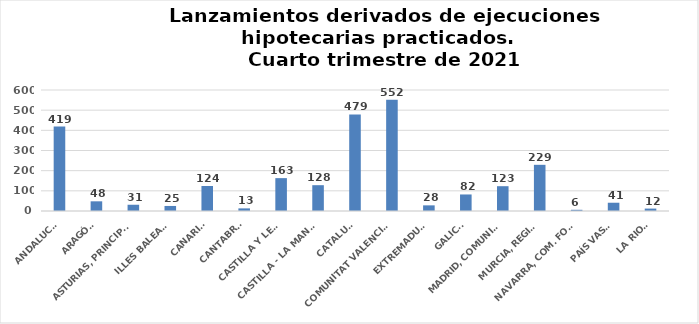
| Category | Series 0 |
|---|---|
| ANDALUCÍA | 419 |
| ARAGÓN | 48 |
| ASTURIAS, PRINCIPADO | 31 |
| ILLES BALEARS | 25 |
| CANARIAS | 124 |
| CANTABRIA | 13 |
| CASTILLA Y LEÓN | 163 |
| CASTILLA - LA MANCHA | 128 |
| CATALUÑA | 479 |
| COMUNITAT VALENCIANA | 552 |
| EXTREMADURA | 28 |
| GALICIA | 82 |
| MADRID, COMUNIDAD | 123 |
| MURCIA, REGIÓN | 229 |
| NAVARRA, COM. FORAL | 6 |
| PAÍS VASCO | 41 |
| LA RIOJA | 12 |